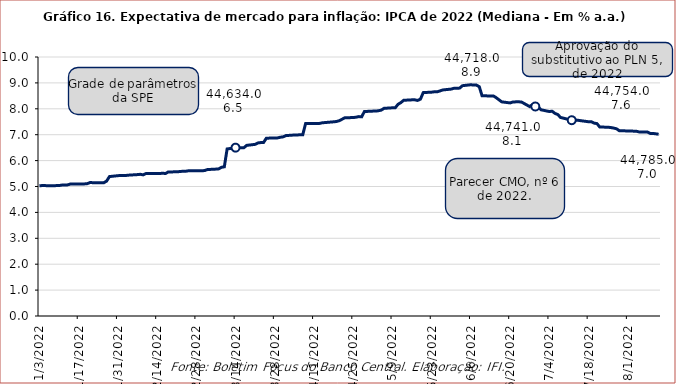
| Category | Expectativa de IPCA |
|---|---|
| 1/3/22 | 5.03 |
| 1/4/22 | 5.035 |
| 1/5/22 | 5.035 |
| 1/6/22 | 5.03 |
| 1/7/22 | 5.03 |
| 1/10/22 | 5.036 |
| 1/11/22 | 5.055 |
| 1/12/22 | 5.062 |
| 1/13/22 | 5.062 |
| 1/14/22 | 5.093 |
| 1/17/22 | 5.1 |
| 1/18/22 | 5.093 |
| 1/19/22 | 5.1 |
| 1/20/22 | 5.107 |
| 1/21/22 | 5.15 |
| 1/24/22 | 5.148 |
| 1/25/22 | 5.146 |
| 1/26/22 | 5.146 |
| 1/27/22 | 5.21 |
| 1/28/22 | 5.383 |
| 1/31/22 | 5.418 |
| 2/1/22 | 5.426 |
| 2/2/22 | 5.426 |
| 2/3/22 | 5.428 |
| 2/4/22 | 5.439 |
| 2/7/22 | 5.459 |
| 2/8/22 | 5.47 |
| 2/9/22 | 5.45 |
| 2/10/22 | 5.499 |
| 2/11/22 | 5.5 |
| 2/14/22 | 5.5 |
| 2/15/22 | 5.5 |
| 2/16/22 | 5.514 |
| 2/17/22 | 5.5 |
| 2/18/22 | 5.562 |
| 2/21/22 | 5.566 |
| 2/22/22 | 5.576 |
| 2/23/22 | 5.587 |
| 2/24/22 | 5.585 |
| 2/25/22 | 5.604 |
| 3/2/22 | 5.606 |
| 3/3/22 | 5.617 |
| 3/4/22 | 5.655 |
| 3/7/22 | 5.672 |
| 3/8/22 | 5.68 |
| 3/9/22 | 5.742 |
| 3/10/22 | 5.76 |
| 3/11/22 | 6.449 |
| 3/14/22 | 6.5 |
| 3/15/22 | 6.5 |
| 3/16/22 | 6.5 |
| 3/17/22 | 6.5 |
| 3/18/22 | 6.588 |
| 3/21/22 | 6.627 |
| 3/22/22 | 6.681 |
| 3/23/22 | 6.696 |
| 3/24/22 | 6.7 |
| 3/25/22 | 6.863 |
| 3/28/22 | 6.877 |
| 3/29/22 | 6.877 |
| 3/30/22 | 6.902 |
| 3/31/22 | 6.917 |
| 4/1/22 | 6.966 |
| 4/4/22 | 6.988 |
| 4/5/22 | 6.988 |
| 4/6/22 | 7 |
| 4/7/22 | 7 |
| 4/8/22 | 7.428 |
| 4/11/22 | 7.437 |
| 4/12/22 | 7.437 |
| 4/13/22 | 7.437 |
| 4/14/22 | 7.46 |
| 4/18/22 | 7.497 |
| 4/19/22 | 7.509 |
| 4/20/22 | 7.54 |
| 4/22/22 | 7.652 |
| 4/25/22 | 7.663 |
| 4/26/22 | 7.675 |
| 4/27/22 | 7.699 |
| 4/28/22 | 7.69 |
| 4/29/22 | 7.894 |
| 5/2/22 | 7.91 |
| 5/3/22 | 7.91 |
| 5/4/22 | 7.926 |
| 5/5/22 | 7.948 |
| 5/6/22 | 8.018 |
| 5/9/22 | 8.039 |
| 5/10/22 | 8.039 |
| 5/11/22 | 8.173 |
| 5/12/22 | 8.237 |
| 5/13/22 | 8.328 |
| 5/16/22 | 8.346 |
| 5/17/22 | 8.346 |
| 5/18/22 | 8.323 |
| 5/19/22 | 8.374 |
| 5/20/22 | 8.625 |
| 5/23/22 | 8.642 |
| 5/24/22 | 8.658 |
| 5/25/22 | 8.658 |
| 5/26/22 | 8.691 |
| 5/27/22 | 8.728 |
| 5/30/22 | 8.761 |
| 5/31/22 | 8.794 |
| 6/1/22 | 8.794 |
| 6/2/22 | 8.799 |
| 6/3/22 | 8.893 |
| 6/6/22 | 8.929 |
| 6/7/22 | 8.914 |
| 6/8/22 | 8.914 |
| 6/9/22 | 8.853 |
| 6/10/22 | 8.5 |
| 6/13/22 | 8.498 |
| 6/14/22 | 8.498 |
| 6/15/22 | 8.432 |
| 6/17/22 | 8.268 |
| 6/20/22 | 8.227 |
| 6/21/22 | 8.263 |
| 6/22/22 | 8.268 |
| 6/23/22 | 8.268 |
| 6/24/22 | 8.266 |
| 6/27/22 | 8.084 |
| 6/28/22 | 8.165 |
| 6/29/22 | 8.089 |
| 6/30/22 | 8.073 |
| 7/1/22 | 7.962 |
| 7/4/22 | 7.895 |
| 7/5/22 | 7.907 |
| 7/6/22 | 7.823 |
| 7/7/22 | 7.779 |
| 7/8/22 | 7.666 |
| 7/11/22 | 7.586 |
| 7/12/22 | 7.559 |
| 7/13/22 | 7.559 |
| 7/14/22 | 7.559 |
| 7/15/22 | 7.544 |
| 7/18/22 | 7.5 |
| 7/19/22 | 7.499 |
| 7/20/22 | 7.447 |
| 7/21/22 | 7.429 |
| 7/22/22 | 7.296 |
| 7/25/22 | 7.289 |
| 7/26/22 | 7.275 |
| 7/27/22 | 7.255 |
| 7/28/22 | 7.228 |
| 7/29/22 | 7.152 |
| 8/1/22 | 7.146 |
| 8/2/22 | 7.147 |
| 8/3/22 | 7.137 |
| 8/4/22 | 7.136 |
| 8/5/22 | 7.108 |
| 8/8/22 | 7.104 |
| 8/9/22 | 7.05 |
| 8/10/22 | 7.05 |
| 8/11/22 | 7.034 |
| 8/12/22 | 7.017 |